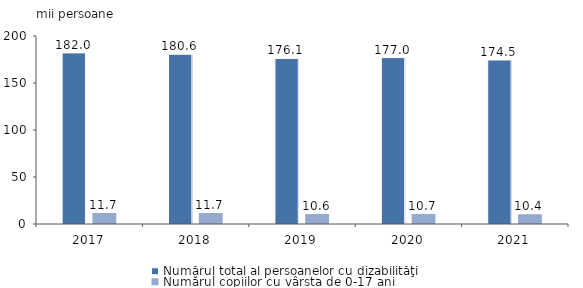
| Category | Numărul total al persoanelor cu dizabilităţi | Numărul copiilor cu vârsta de 0-17 ani |
|---|---|---|
| 2017.0 | 182.03 | 11.7 |
| 2018.0 | 180.6 | 11.7 |
| 2019.0 | 176.1 | 10.6 |
| 2020.0 | 177 | 10.7 |
| 2021.0 | 174.5 | 10.4 |